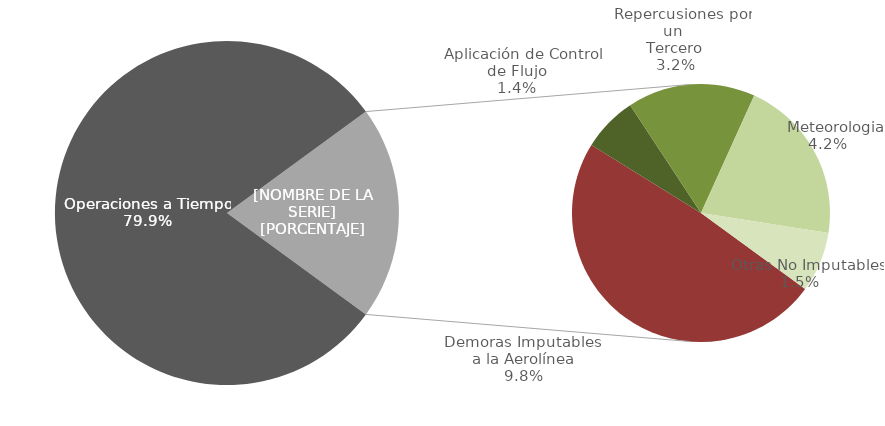
| Category | Demoras |
|---|---|
| Operaciones a Tiempo | 411075 |
| Demoras Imputables 
a la Aerolínea | 50385 |
|    Aplicación de Control 
de Flujo | 7140 |
|    Repercusiones por un 
Tercero | 16537 |
|    Meteorologia | 21383 |
|    Otras No Imputables | 7806 |